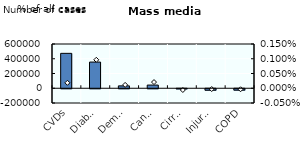
| Category | Number of cases |
|---|---|
| CVDs | 473097.214 |
| Diabetes | 355036.641 |
| Dementia | 32217.657 |
| Cancers | 43197.888 |
| Cirrhosis | -2540.824 |
| Injuries | -19890.687 |
| COPD | -18681.997 |